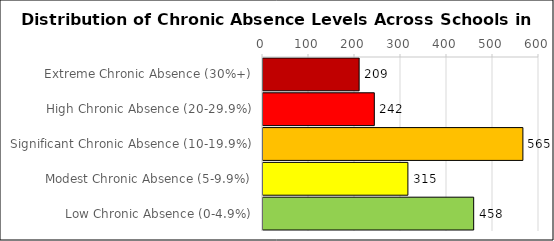
| Category | Number of Schools |
|---|---|
| Extreme Chronic Absence (30%+) | 209 |
| High Chronic Absence (20-29.9%) | 242 |
| Significant Chronic Absence (10-19.9%) | 565 |
| Modest Chronic Absence (5-9.9%) | 315 |
| Low Chronic Absence (0-4.9%) | 458 |